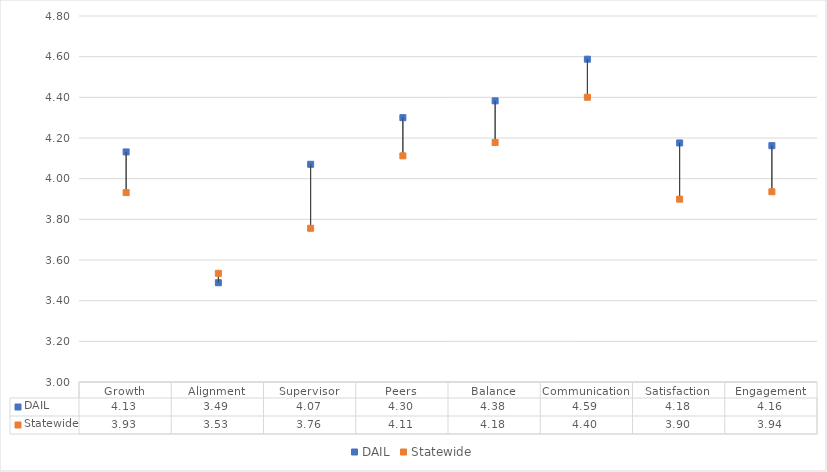
| Category | DAIL | Statewide |
|---|---|---|
| Growth | 4.132 | 3.931 |
| Alignment | 3.488 | 3.534 |
| Supervisor | 4.071 | 3.756 |
| Peers | 4.3 | 4.112 |
| Balance | 4.383 | 4.178 |
| Communication | 4.588 | 4.4 |
| Satisfaction | 4.176 | 3.899 |
| Engagement | 4.162 | 3.936 |